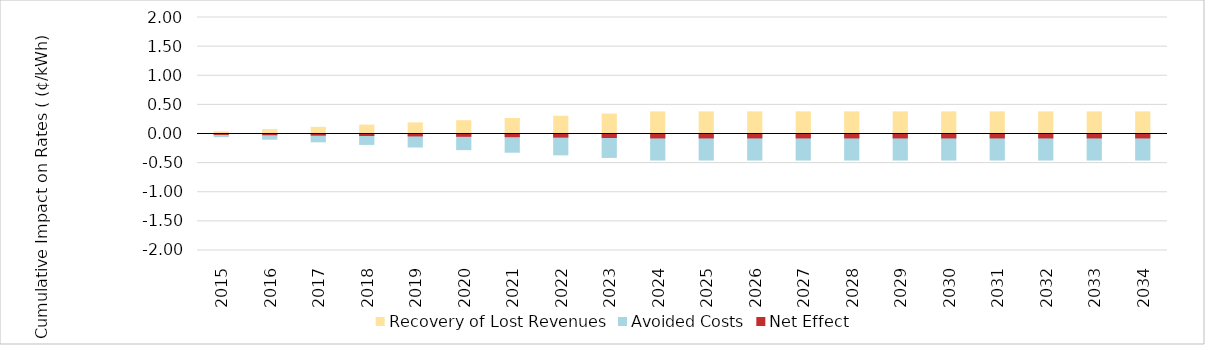
| Category | Recovery of Lost Revenues | Avoided Costs |
|---|---|---|
| 2015.0 | 0.038 | -0.045 |
| 2016.0 | 0.076 | -0.089 |
| 2017.0 | 0.114 | -0.134 |
| 2018.0 | 0.153 | -0.179 |
| 2019.0 | 0.191 | -0.224 |
| 2020.0 | 0.229 | -0.268 |
| 2021.0 | 0.266 | -0.313 |
| 2022.0 | 0.304 | -0.358 |
| 2023.0 | 0.342 | -0.402 |
| 2024.0 | 0.38 | -0.447 |
| 2025.0 | 0.38 | -0.447 |
| 2026.0 | 0.38 | -0.447 |
| 2027.0 | 0.38 | -0.447 |
| 2028.0 | 0.38 | -0.447 |
| 2029.0 | 0.38 | -0.447 |
| 2030.0 | 0.38 | -0.447 |
| 2031.0 | 0.38 | -0.447 |
| 2032.0 | 0.38 | -0.447 |
| 2033.0 | 0.38 | -0.447 |
| 2034.0 | 0.38 | -0.447 |